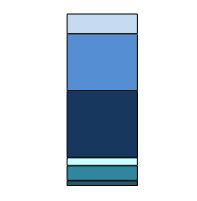
| Category | Series 0 | Series 1 | Series 2 | Series 3 | Series 4 | Series 5 |
|---|---|---|---|---|---|---|
| 0 | 150 | 437 | 233 | 1941 | 1660 | 586 |